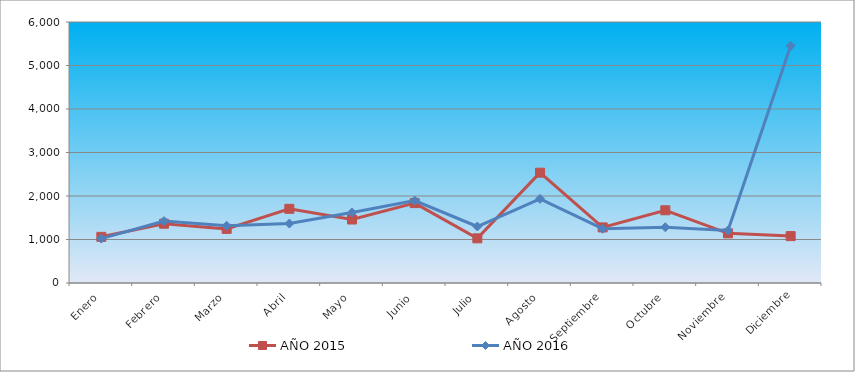
| Category | AÑO 2015 | AÑO 2016 |
|---|---|---|
| Enero | 1061.121 | 1020.931 |
| Febrero | 1363.483 | 1423.631 |
| Marzo | 1243.679 | 1315.866 |
| Abril | 1705.78 | 1366.913 |
| Mayo | 1460.467 | 1622.145 |
| Junio | 1836.994 | 1894.393 |
| Julio | 1026.891 | 1298.851 |
| Agosto | 2535.939 | 1934.096 |
| Septiembre | 1277.909 | 1247.804 |
| Octubre | 1671.55 | 1281.835 |
| Noviembre | 1140.99 | 1208.101 |
| Diciembre | 1078.236 | 5451.99 |